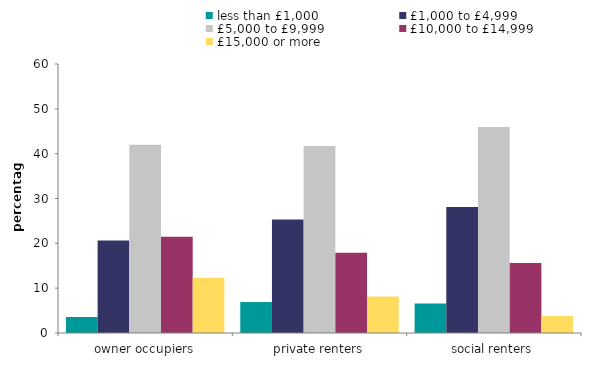
| Category | less than £1,000 | £1,000 to £4,999 | £5,000 to £9,999 | £10,000 to £14,999 | £15,000 or more |
|---|---|---|---|---|---|
| owner occupiers | 3.593 | 20.634 | 41.969 | 21.457 | 12.346 |
| private renters | 6.903 | 25.331 | 41.709 | 17.924 | 8.133 |
| social renters | 6.565 | 28.102 | 45.949 | 15.616 | 3.768 |